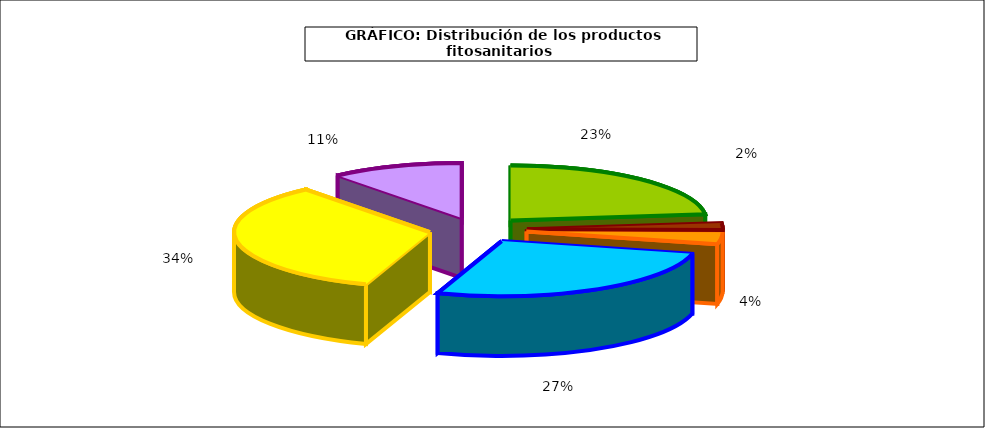
| Category | Series 0 |
|---|---|
|  | 314.413 |
|  | 27.806 |
|  | 47.626 |
|  | 361.395 |
|  | 459.265 |
|  | 148.099 |